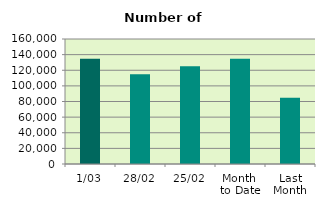
| Category | Series 0 |
|---|---|
| 1/03 | 134576 |
| 28/02 | 114776 |
| 25/02 | 125020 |
| Month 
to Date | 134576 |
| Last
Month | 84726.4 |